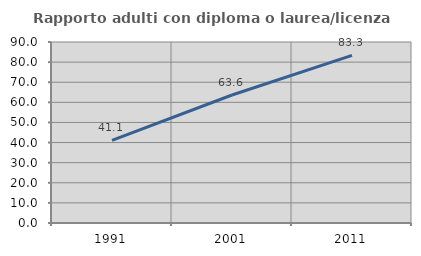
| Category | Rapporto adulti con diploma o laurea/licenza media  |
|---|---|
| 1991.0 | 41.111 |
| 2001.0 | 63.636 |
| 2011.0 | 83.333 |